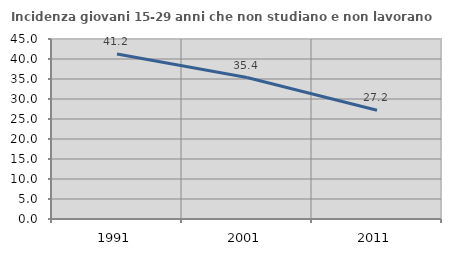
| Category | Incidenza giovani 15-29 anni che non studiano e non lavorano  |
|---|---|
| 1991.0 | 41.235 |
| 2001.0 | 35.371 |
| 2011.0 | 27.177 |